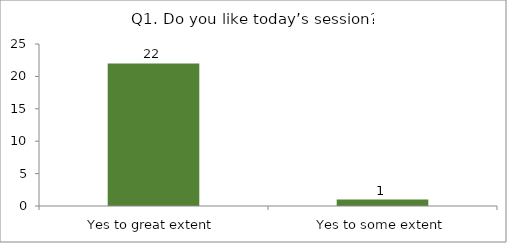
| Category | Q1. Do you like today’s session? |
|---|---|
| Yes to great extent | 22 |
| Yes to some extent | 1 |